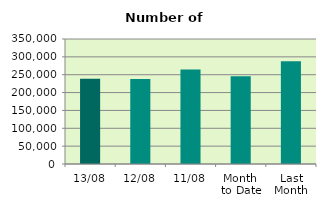
| Category | Series 0 |
|---|---|
| 13/08 | 238626 |
| 12/08 | 238290 |
| 11/08 | 264912 |
| Month 
to Date | 245834.4 |
| Last
Month | 287917.636 |